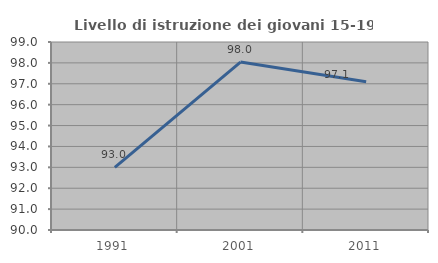
| Category | Livello di istruzione dei giovani 15-19 anni |
|---|---|
| 1991.0 | 93 |
| 2001.0 | 98.039 |
| 2011.0 | 97.101 |